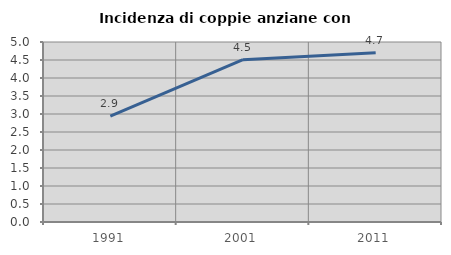
| Category | Incidenza di coppie anziane con figli |
|---|---|
| 1991.0 | 2.941 |
| 2001.0 | 4.508 |
| 2011.0 | 4.701 |